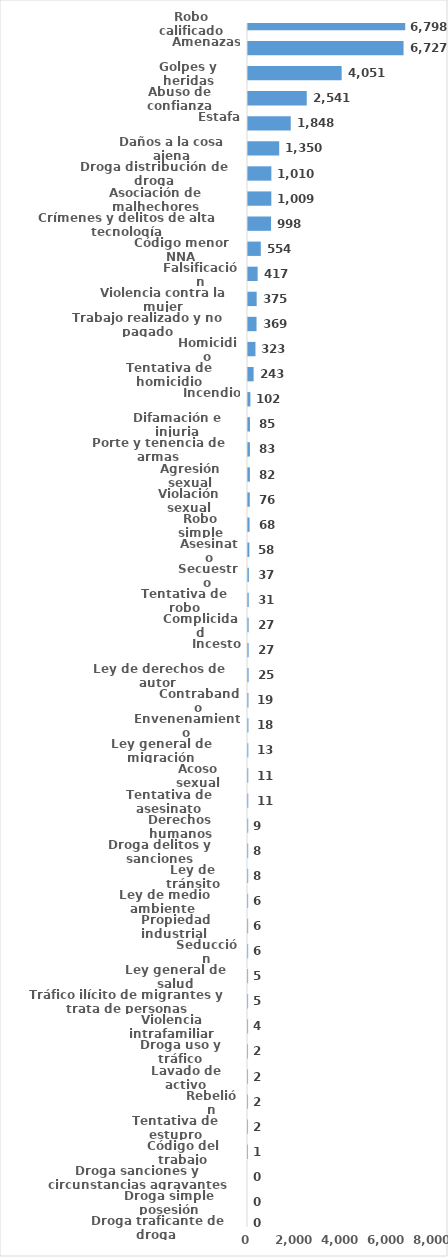
| Category | Series 0 |
|---|---|
| Robo calificado | 6798 |
| Amenazas | 6727 |
| Golpes y heridas | 4051 |
| Abuso de confianza | 2541 |
| Estafa | 1848 |
| Daños a la cosa ajena | 1350 |
| Droga distribución de droga | 1010 |
| Asociación de malhechores | 1009 |
| Crímenes y delitos de alta tecnología | 998 |
| Código menor NNA | 554 |
| Falsificación | 417 |
| Violencia contra la mujer | 375 |
| Trabajo realizado y no pagado | 369 |
| Homicidio | 323 |
| Tentativa de homicidio | 243 |
| Incendio | 102 |
| Difamación e injuria | 85 |
| Porte y tenencia de armas | 83 |
| Agresión sexual | 82 |
| Violación sexual | 76 |
| Robo simple | 68 |
| Asesinato | 58 |
| Secuestro | 37 |
| Tentativa de robo | 31 |
| Complicidad | 27 |
| Incesto | 27 |
| Ley de derechos de autor  | 25 |
| Contrabando | 19 |
| Envenenamiento | 18 |
| Ley general de migración | 13 |
| Acoso sexual | 11 |
| Tentativa de asesinato | 11 |
| Derechos humanos | 9 |
| Droga delitos y sanciones | 8 |
| Ley de tránsito | 8 |
| Ley de medio ambiente  | 6 |
| Propiedad industrial  | 6 |
| Seducción | 6 |
| Ley general de salud | 5 |
| Tráfico ilícito de migrantes y trata de personas | 5 |
| Violencia intrafamiliar | 4 |
| Droga uso y tráfico | 2 |
| Lavado de activo | 2 |
| Rebelión | 2 |
| Tentativa de estupro | 2 |
| Código del trabajo | 1 |
| Droga sanciones y circunstancias agravantes | 0 |
| Droga simple posesión | 0 |
| Droga traficante de droga  | 0 |